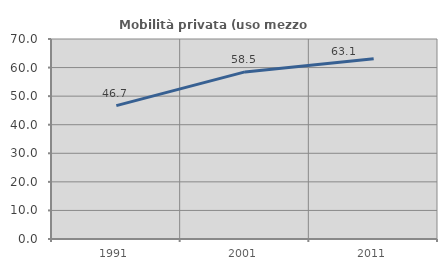
| Category | Mobilità privata (uso mezzo privato) |
|---|---|
| 1991.0 | 46.667 |
| 2001.0 | 58.482 |
| 2011.0 | 63.082 |